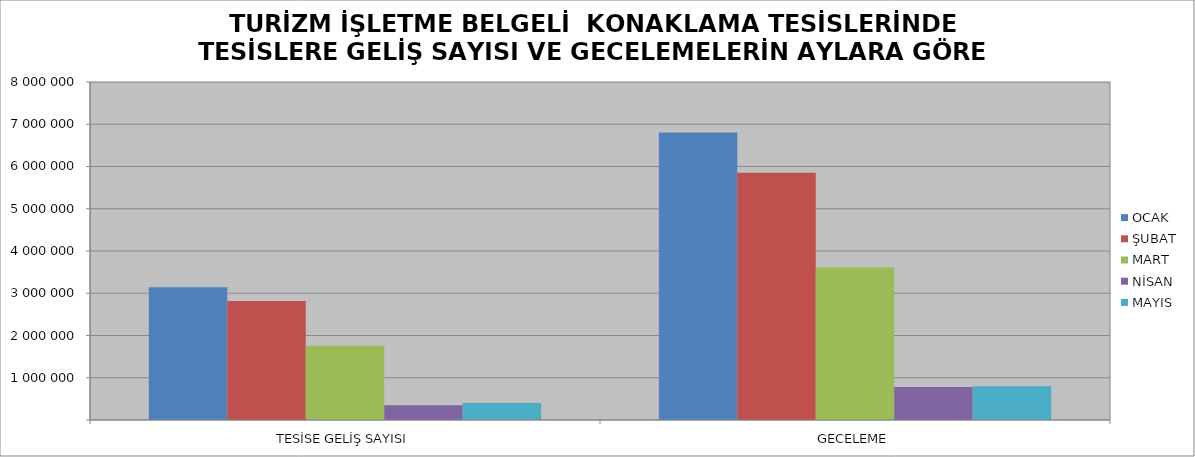
| Category | OCAK | ŞUBAT | MART | NİSAN | MAYIS |
|---|---|---|---|---|---|
| TESİSE GELİŞ SAYISI | 3140857 | 2816145 | 1756166 | 346964 | 400777 |
| GECELEME | 6806196 | 5853519 | 3616071 | 781724 | 800953 |